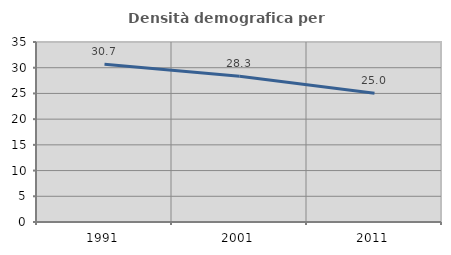
| Category | Densità demografica |
|---|---|
| 1991.0 | 30.654 |
| 2001.0 | 28.341 |
| 2011.0 | 25.044 |